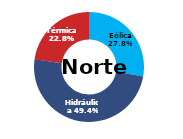
| Category | Norte |
|---|---|
| Eólica | 69.96 |
| Hidráulica | 124.594 |
| Solar | 0 |
| Térmica | 57.414 |